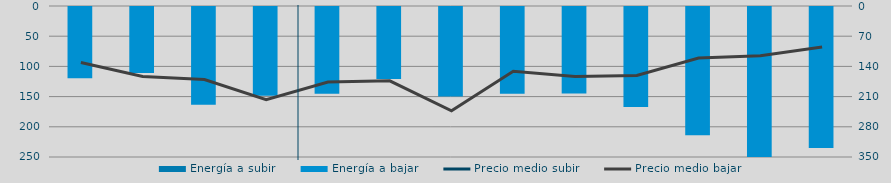
| Category | Energía a subir | Energía a bajar |
|---|---|---|
| S |  | 119.623 |
| O |  | 110.774 |
| N |  | 163.48 |
| D |  | 148.636 |
| E |  | 145.389 |
| F |  | 120.749 |
| M |  | 149.634 |
| A |  | 145.138 |
| M |  | 144.774 |
| J |  | 167.273 |
| J |  | 214.145 |
| A |  | 250.233 |
| S |  | 235.221 |